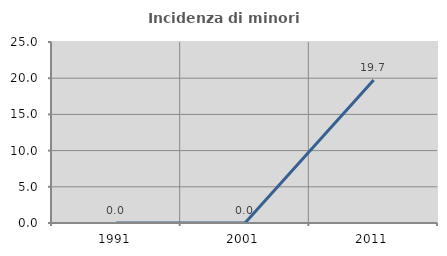
| Category | Incidenza di minori stranieri |
|---|---|
| 1991.0 | 0 |
| 2001.0 | 0 |
| 2011.0 | 19.737 |